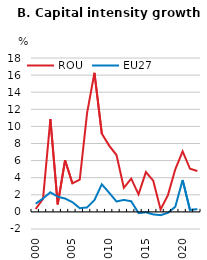
| Category | ROU | EU27 |
|---|---|---|
| 2000.0 | 0.338 | 0.957 |
| 2001.0 | 1.53 | 1.574 |
| 2002.0 | 10.852 | 2.294 |
| 2003.0 | 0.881 | 1.777 |
| 2004.0 | 6.041 | 1.563 |
| 2005.0 | 3.333 | 1.142 |
| 2006.0 | 3.786 | 0.431 |
| 2007.0 | 11.574 | 0.523 |
| 2008.0 | 16.274 | 1.381 |
| 2009.0 | 9.157 | 3.228 |
| 2010.0 | 7.757 | 2.24 |
| 2011.0 | 6.65 | 1.217 |
| 2012.0 | 2.82 | 1.403 |
| 2013.0 | 3.897 | 1.244 |
| 2014.0 | 2.057 | -0.14 |
| 2015.0 | 4.655 | -0.045 |
| 2016.0 | 3.649 | -0.295 |
| 2017.0 | 0.28 | -0.382 |
| 2018.0 | 1.962 | -0.108 |
| 2019.0 | 4.98 | 0.602 |
| 2020.0 | 7.073 | 3.726 |